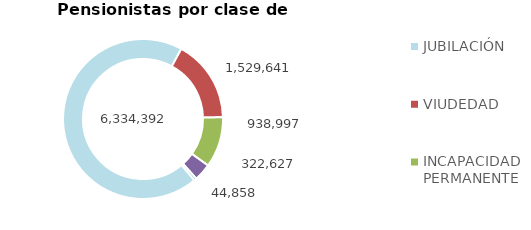
| Category | Series 0 |
|---|---|
| JUBILACIÓN | 6334392 |
| VIUDEDAD | 1529641 |
| INCAPACIDAD PERMANENTE | 938997 |
| ORFANDAD | 322627 |
| FAVOR DE FAMILIARES | 44858 |